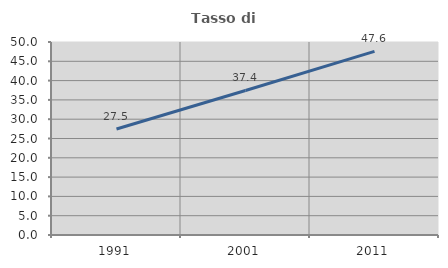
| Category | Tasso di occupazione   |
|---|---|
| 1991.0 | 27.451 |
| 2001.0 | 37.441 |
| 2011.0 | 47.581 |